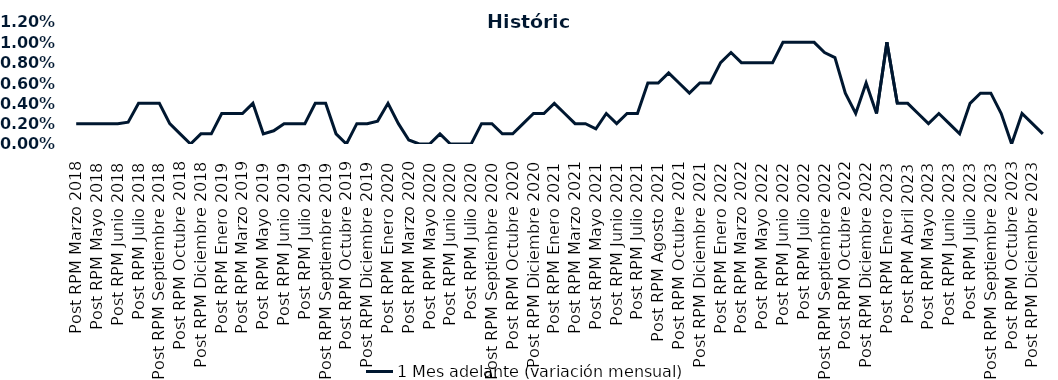
| Category | 1 Mes adelante (variación mensual) |
|---|---|
| Post RPM Marzo 2018 | 0.002 |
| Pre RPM Mayo 2018 | 0.002 |
| Post RPM Mayo 2018 | 0.002 |
| Pre RPM Junio 2018 | 0.002 |
| Post RPM Junio 2018 | 0.002 |
| Pre RPM Julio 2018 | 0.002 |
| Post RPM Julio 2018 | 0.004 |
| Pre RPM Septiembre 2018 | 0.004 |
| Post RPM Septiembre 2018 | 0.004 |
| Pre RPM Octubre 2018 | 0.002 |
| Post RPM Octubre 2018 | 0.001 |
| Pre RPM Diciembre 2018 | 0 |
| Post RPM Diciembre 2018 | 0.001 |
| Pre RPM Enero 2019 | 0.001 |
| Post RPM Enero 2019 | 0.003 |
| Pre RPM Marzo 2019 | 0.003 |
| Post RPM Marzo 2019 | 0.003 |
| Pre RPM Mayo 2019 | 0.004 |
| Post RPM Mayo 2019 | 0.001 |
| Pre RPM Junio 2019 | 0.001 |
| Post RPM Junio 2019 | 0.002 |
| Pre RPM Julio 2019 | 0.002 |
| Post RPM Julio 2019 | 0.002 |
| Pre RPM Septiembre 2019 | 0.004 |
| Post RPM Septiembre 2019 | 0.004 |
| Pre RPM Octubre 2019 | 0.001 |
| Post RPM Octubre 2019 | 0 |
| Pre RPM Diciembre 2019 | 0.002 |
| Post RPM Diciembre 2019 | 0.002 |
| Pre RPM Enero 2020 | 0.002 |
| Post RPM Enero 2020 | 0.004 |
| Pre RPM Marzo 2020 | 0.002 |
| Post RPM Marzo 2020 | 0 |
| Pre RPM Mayo 2020 | 0 |
| Post RPM Mayo 2020 | 0 |
| Pre RPM Junio 2020 | 0.001 |
| Post RPM Junio 2020 | 0 |
| Pre RPM Julio 2020 | 0 |
| Post RPM Julio 2020 | 0 |
| Pre RPM Septiembre 2020 | 0.002 |
| Post RPM Septiembre 2020 | 0.002 |
| Pre RPM Octubre 2020 | 0.001 |
| Post RPM Octubre 2020 | 0.001 |
| Pre RPM Diciembre 2020 | 0.002 |
| Post RPM Diciembre 2020 | 0.003 |
| Pre RPM Enero 2021 | 0.003 |
| Post RPM Enero 2021 | 0.004 |
| Pre RPM Marzo 2021 | 0.003 |
| Post RPM Marzo 2021 | 0.002 |
| Pre RPM Mayo 2021 | 0.002 |
| Post RPM Mayo 2021 | 0.002 |
| Pre RPM Junio 2021 | 0.003 |
| Post RPM Junio 2021 | 0.002 |
| Pre RPM Julio 2021 | 0.003 |
| Post RPM Julio 2021 | 0.003 |
| Pre RPM Agosto 2021 | 0.006 |
| Post RPM Agosto 2021 | 0.006 |
| Pre RPM Octubre 2021 | 0.007 |
| Post RPM Octubre 2021 | 0.006 |
| Pre RPM Diciembre 2021 | 0.005 |
| Post RPM Diciembre 2021 | 0.006 |
| Pre RPM Enero 2022 | 0.006 |
| Post RPM Enero 2022 | 0.008 |
| Pre RPM Marzo 2022 | 0.009 |
| Post RPM Marzo 2022 | 0.008 |
| Pre RPM Mayo 2022 | 0.008 |
| Post RPM Mayo 2022 | 0.008 |
| Pre RPM Junio 2022 | 0.008 |
| Post RPM Junio 2022 | 0.01 |
| Pre RPM Julio 2022 | 0.01 |
| Post RPM Julio 2022 | 0.01 |
| Pre RPM Septiembre 2022 | 0.01 |
| Post RPM Septiembre 2022 | 0.009 |
| Pre RPM Octubre 2022 | 0.008 |
| Post RPM Octubre 2022 | 0.005 |
| Pre RPM Diciembre 2022 | 0.003 |
| Post RPM Diciembre 2022 | 0.006 |
| Pre RPM Enero 2023 | 0.003 |
| Post RPM Enero 2023 | 0.01 |
| Pre RPM Abril 2023 | 0.004 |
| Post RPM Abril 2023 | 0.004 |
| Pre RPM Mayo 2023 | 0.003 |
| Post RPM Mayo 2023 | 0.002 |
| Pre RPM Junio 2023 | 0.003 |
| Post RPM Junio 2023 | 0.002 |
| Pre RPM Julio 2023 | 0.001 |
| Post RPM Julio 2023 | 0.004 |
| Pre RPM Septiembre 2023 | 0.005 |
| Post RPM Septiembre 2023 | 0.005 |
| Pre RPM Octubre 2023 | 0.003 |
| Post RPM Octubre 2023 | 0 |
| Pre RPM Diciembre 2023 | 0.003 |
| Post RPM Diciembre 2023 | 0.002 |
| Pre RPM Enero 2024 | 0.001 |